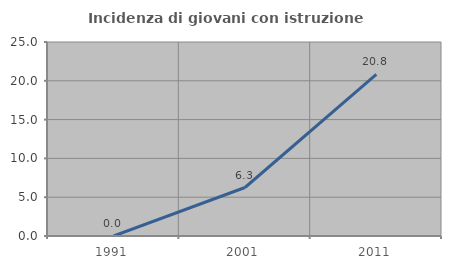
| Category | Incidenza di giovani con istruzione universitaria |
|---|---|
| 1991.0 | 0 |
| 2001.0 | 6.25 |
| 2011.0 | 20.833 |